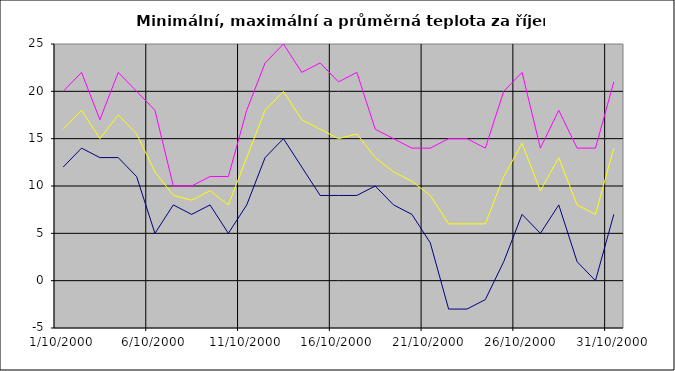
| Category | Series 0 | Series 1 | Series 2 |
|---|---|---|---|
| 2000-10-01 | 12 | 20 | 16 |
| 2000-10-02 | 14 | 22 | 18 |
| 2000-10-03 | 13 | 17 | 15 |
| 2000-10-04 | 13 | 22 | 17.5 |
| 2000-10-05 | 11 | 20 | 15.5 |
| 2000-10-06 | 5 | 18 | 11.5 |
| 2000-10-07 | 8 | 10 | 9 |
| 2000-10-08 | 7 | 10 | 8.5 |
| 2000-10-09 | 8 | 11 | 9.5 |
| 2000-10-10 | 5 | 11 | 8 |
| 2000-10-11 | 8 | 18 | 13 |
| 2000-10-12 | 13 | 23 | 18 |
| 2000-10-13 | 15 | 25 | 20 |
| 2000-10-14 | 12 | 22 | 17 |
| 2000-10-15 | 9 | 23 | 16 |
| 2000-10-16 | 9 | 21 | 15 |
| 2000-10-17 | 9 | 22 | 15.5 |
| 2000-10-18 | 10 | 16 | 13 |
| 2000-10-19 | 8 | 15 | 11.5 |
| 2000-10-20 | 7 | 14 | 10.5 |
| 2000-10-21 | 4 | 14 | 9 |
| 2000-10-22 | -3 | 15 | 6 |
| 2000-10-23 | -3 | 15 | 6 |
| 2000-10-24 | -2 | 14 | 6 |
| 2000-10-25 | 2 | 20 | 11 |
| 2000-10-26 | 7 | 22 | 14.5 |
| 2000-10-27 | 5 | 14 | 9.5 |
| 2000-10-28 | 8 | 18 | 13 |
| 2000-10-29 | 2 | 14 | 8 |
| 2000-10-30 | 0 | 14 | 7 |
| 2000-10-31 | 7 | 21 | 14 |